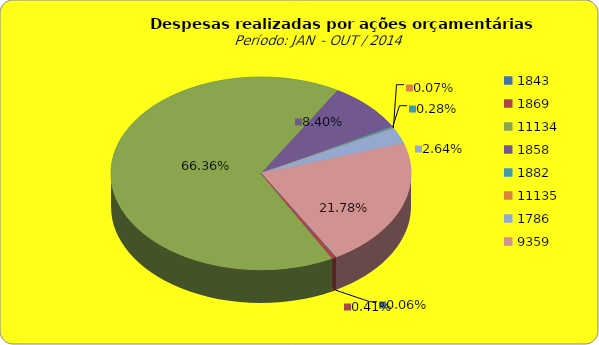
| Category | Series 1 |
|---|---|
| 1843.0 | 100000 |
| 1869.0 | 658740.88 |
| 11134.0 | 107300616.71 |
| 1858.0 | 13575998.83 |
| 1882.0 | 460659.2 |
| 11135.0 | 107037.95 |
| 1786.0 | 4274955.19 |
| 9359.0 | 35210493.28 |